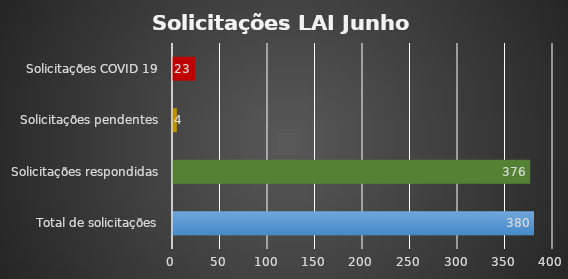
| Category | Series 0 |
|---|---|
| Total de solicitações | 380 |
| Solicitações respondidas | 376 |
| Solicitações pendentes | 4 |
| Solicitações COVID 19 | 23 |